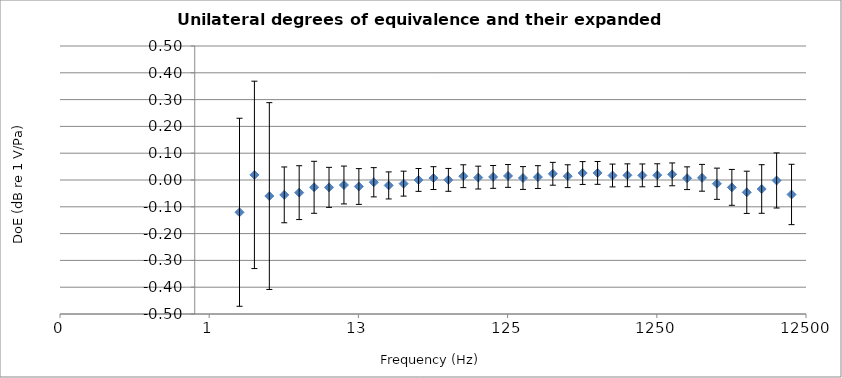
| Category | Series 0 |
|---|---|
| 1.995262314968878 | -0.12 |
| 2.5118864315095797 | 0.019 |
| 3.1622776601683764 | -0.06 |
| 3.98107170553497 | -0.055 |
| 5.011872336272721 | -0.047 |
| 6.309573444801931 | -0.027 |
| 7.943282347242812 | -0.027 |
| 9.999999999999995 | -0.019 |
| 12.589254117941676 | -0.024 |
| 15.8489319246111 | -0.008 |
| 19.9526231496888 | -0.02 |
| 25.118864315095806 | -0.014 |
| 31.62277660168378 | 0 |
| 39.81071705534971 | 0.007 |
| 50.11872336272723 | 0 |
| 63.0957344480193 | 0.014 |
| 79.43282347242814 | 0.009 |
| 100.0 | 0.011 |
| 125.8925411794167 | 0.015 |
| 158.48931924611136 | 0.007 |
| 199.52623149688793 | 0.011 |
| 251.18864315095794 | 0.023 |
| 316.22776601683796 | 0.014 |
| 398.10717055349727 | 0.026 |
| 501.18723362727224 | 0.026 |
| 630.9573444801932 | 0.017 |
| 794.3282347242815 | 0.018 |
| 1000.0 | 0.017 |
| 1258.9254117941673 | 0.018 |
| 1584.8931924611134 | 0.021 |
| 1995.2623149688798 | 0.007 |
| 2511.8864315095802 | 0.008 |
| 3162.2776601683795 | -0.014 |
| 3981.0717055349733 | -0.027 |
| 5011.872336272724 | -0.046 |
| 6309.573444801932 | -0.034 |
| 7943.282347242816 | -0.002 |
| 10000.0 | -0.054 |